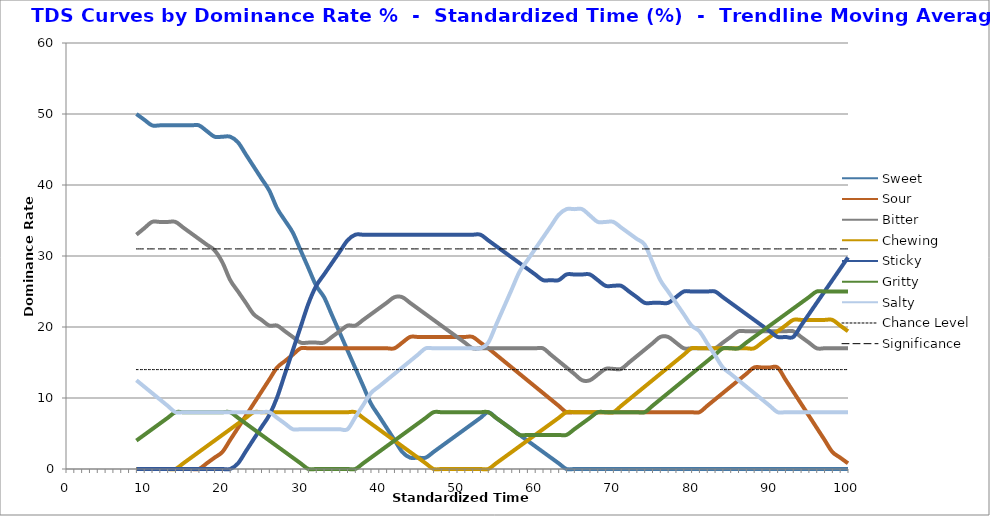
| Category | Sweet | Sour | Bitter | Chewing | Sticky | Gritty | Salty | Chance Level | Significance |
|---|---|---|---|---|---|---|---|---|---|
| 0.0 | 50 | 0 | 33 | 0 | 0 | 0 | 17 | 14 | 31 |
| 1.0 | 50 | 0 | 33 | 0 | 0 | 0 | 17 | 14 | 31 |
| 2.0 | 50 | 0 | 33 | 0 | 0 | 0 | 17 | 14 | 31 |
| 3.0 | 50 | 0 | 33 | 0 | 0 | 0 | 17 | 14 | 31 |
| 4.0 | 50 | 0 | 33 | 0 | 0 | 0 | 17 | 14 | 31 |
| 5.0 | 50 | 0 | 33 | 0 | 0 | 8 | 8 | 14 | 31 |
| 6.0 | 50 | 0 | 33 | 0 | 0 | 8 | 8 | 14 | 31 |
| 7.0 | 50 | 0 | 33 | 0 | 0 | 8 | 8 | 14 | 31 |
| 8.0 | 50 | 0 | 33 | 0 | 0 | 8 | 8 | 14 | 31 |
| 9.0 | 50 | 0 | 33 | 0 | 0 | 8 | 8 | 14 | 31 |
| 10.0 | 42 | 0 | 42 | 0 | 0 | 8 | 8 | 14 | 31 |
| 11.0 | 42 | 0 | 42 | 0 | 0 | 8 | 8 | 14 | 31 |
| 12.0 | 50 | 0 | 33 | 0 | 0 | 8 | 8 | 14 | 31 |
| 13.0 | 50 | 0 | 33 | 0 | 0 | 8 | 8 | 14 | 31 |
| 14.0 | 50 | 0 | 33 | 0 | 0 | 8 | 8 | 14 | 31 |
| 15.0 | 50 | 0 | 25 | 8 | 0 | 8 | 8 | 14 | 31 |
| 16.0 | 50 | 0 | 25 | 8 | 0 | 8 | 8 | 14 | 31 |
| 17.0 | 50 | 0 | 25 | 8 | 0 | 8 | 8 | 14 | 31 |
| 18.0 | 42 | 8 | 25 | 8 | 0 | 8 | 8 | 14 | 31 |
| 19.0 | 42 | 8 | 25 | 8 | 0 | 8 | 8 | 14 | 31 |
| 20.0 | 42 | 8 | 25 | 8 | 0 | 8 | 8 | 14 | 31 |
| 21.0 | 42 | 17 | 17 | 8 | 0 | 8 | 8 | 14 | 31 |
| 22.0 | 42 | 17 | 17 | 8 | 8 | 0 | 8 | 14 | 31 |
| 23.0 | 33 | 17 | 17 | 8 | 17 | 0 | 8 | 14 | 31 |
| 24.0 | 33 | 17 | 17 | 8 | 17 | 0 | 8 | 14 | 31 |
| 25.0 | 33 | 17 | 17 | 8 | 17 | 0 | 8 | 14 | 31 |
| 26.0 | 33 | 17 | 17 | 8 | 17 | 0 | 8 | 14 | 31 |
| 27.0 | 25 | 17 | 25 | 8 | 25 | 0 | 0 | 14 | 31 |
| 28.0 | 25 | 17 | 17 | 8 | 33 | 0 | 0 | 14 | 31 |
| 29.0 | 25 | 17 | 17 | 8 | 33 | 0 | 0 | 14 | 31 |
| 30.0 | 17 | 17 | 17 | 8 | 33 | 0 | 8 | 14 | 31 |
| 31.0 | 17 | 17 | 17 | 8 | 33 | 0 | 8 | 14 | 31 |
| 32.0 | 17 | 17 | 17 | 8 | 33 | 0 | 8 | 14 | 31 |
| 33.0 | 17 | 17 | 17 | 8 | 33 | 0 | 8 | 14 | 31 |
| 34.0 | 8 | 17 | 25 | 8 | 33 | 0 | 8 | 14 | 31 |
| 35.0 | 8 | 17 | 25 | 8 | 33 | 0 | 8 | 14 | 31 |
| 36.0 | 8 | 17 | 25 | 8 | 33 | 0 | 8 | 14 | 31 |
| 37.0 | 0 | 17 | 25 | 8 | 33 | 0 | 17 | 14 | 31 |
| 38.0 | 0 | 17 | 25 | 0 | 33 | 8 | 17 | 14 | 31 |
| 39.0 | 0 | 17 | 25 | 0 | 33 | 8 | 17 | 14 | 31 |
| 40.0 | 0 | 17 | 25 | 0 | 33 | 8 | 17 | 14 | 31 |
| 41.0 | 0 | 17 | 25 | 0 | 33 | 8 | 17 | 14 | 31 |
| 42.0 | 0 | 17 | 25 | 0 | 33 | 8 | 17 | 14 | 31 |
| 43.0 | 0 | 25 | 17 | 0 | 33 | 8 | 17 | 14 | 31 |
| 44.0 | 0 | 25 | 17 | 0 | 33 | 8 | 17 | 14 | 31 |
| 45.0 | 8 | 17 | 17 | 0 | 33 | 8 | 17 | 14 | 31 |
| 46.0 | 8 | 17 | 17 | 0 | 33 | 8 | 17 | 14 | 31 |
| 47.0 | 8 | 17 | 17 | 0 | 33 | 8 | 17 | 14 | 31 |
| 48.0 | 8 | 17 | 17 | 0 | 33 | 8 | 17 | 14 | 31 |
| 49.0 | 8 | 17 | 17 | 0 | 33 | 8 | 17 | 14 | 31 |
| 50.0 | 8 | 17 | 17 | 0 | 33 | 8 | 17 | 14 | 31 |
| 51.0 | 8 | 17 | 17 | 0 | 33 | 8 | 17 | 14 | 31 |
| 52.0 | 8 | 17 | 17 | 0 | 33 | 8 | 17 | 14 | 31 |
| 53.0 | 8 | 17 | 17 | 0 | 33 | 8 | 17 | 14 | 31 |
| 54.0 | 8 | 17 | 17 | 0 | 25 | 8 | 25 | 14 | 31 |
| 55.0 | 0 | 8 | 17 | 8 | 25 | 0 | 42 | 14 | 31 |
| 56.0 | 0 | 8 | 17 | 8 | 25 | 0 | 42 | 14 | 31 |
| 57.0 | 0 | 8 | 17 | 8 | 25 | 0 | 42 | 14 | 31 |
| 58.0 | 0 | 8 | 17 | 8 | 25 | 0 | 42 | 14 | 31 |
| 59.0 | 0 | 8 | 17 | 8 | 25 | 8 | 33 | 14 | 31 |
| 60.0 | 0 | 8 | 17 | 8 | 25 | 8 | 33 | 14 | 31 |
| 61.0 | 0 | 8 | 17 | 8 | 25 | 8 | 33 | 14 | 31 |
| 62.0 | 0 | 8 | 8 | 8 | 33 | 8 | 33 | 14 | 31 |
| 63.0 | 0 | 8 | 8 | 8 | 33 | 8 | 33 | 14 | 31 |
| 64.0 | 0 | 8 | 8 | 8 | 33 | 8 | 33 | 14 | 31 |
| 65.0 | 0 | 8 | 8 | 8 | 25 | 8 | 42 | 14 | 31 |
| 66.0 | 0 | 8 | 8 | 8 | 25 | 8 | 42 | 14 | 31 |
| 67.0 | 0 | 8 | 17 | 8 | 25 | 8 | 33 | 14 | 31 |
| 68.0 | 0 | 8 | 25 | 8 | 17 | 8 | 33 | 14 | 31 |
| 69.0 | 0 | 8 | 25 | 8 | 17 | 8 | 33 | 14 | 31 |
| 70.0 | 0 | 8 | 17 | 8 | 25 | 8 | 33 | 14 | 31 |
| 71.0 | 0 | 8 | 17 | 17 | 25 | 8 | 25 | 14 | 31 |
| 72.0 | 0 | 8 | 17 | 17 | 25 | 8 | 25 | 14 | 31 |
| 73.0 | 0 | 8 | 17 | 17 | 25 | 8 | 25 | 14 | 31 |
| 74.0 | 0 | 8 | 17 | 17 | 25 | 8 | 25 | 14 | 31 |
| 75.0 | 0 | 8 | 17 | 17 | 25 | 17 | 17 | 14 | 31 |
| 76.0 | 0 | 8 | 17 | 17 | 25 | 17 | 17 | 14 | 31 |
| 77.0 | 0 | 8 | 17 | 17 | 25 | 17 | 17 | 14 | 31 |
| 78.0 | 0 | 8 | 17 | 17 | 25 | 17 | 17 | 14 | 31 |
| 79.0 | 0 | 8 | 17 | 17 | 25 | 17 | 17 | 14 | 31 |
| 80.0 | 0 | 8 | 17 | 17 | 25 | 17 | 17 | 14 | 31 |
| 81.0 | 0 | 8 | 17 | 17 | 25 | 17 | 17 | 14 | 31 |
| 82.0 | 0 | 17 | 17 | 17 | 25 | 17 | 8 | 14 | 31 |
| 83.0 | 0 | 17 | 17 | 17 | 25 | 17 | 8 | 14 | 31 |
| 84.0 | 0 | 17 | 25 | 17 | 17 | 17 | 8 | 14 | 31 |
| 85.0 | 0 | 17 | 25 | 17 | 17 | 17 | 8 | 14 | 31 |
| 86.0 | 0 | 17 | 25 | 17 | 17 | 17 | 8 | 14 | 31 |
| 87.0 | 0 | 17 | 17 | 17 | 17 | 25 | 8 | 14 | 31 |
| 88.0 | 0 | 17 | 17 | 17 | 17 | 25 | 8 | 14 | 31 |
| 89.0 | 0 | 8 | 17 | 25 | 17 | 25 | 8 | 14 | 31 |
| 90.0 | 0 | 8 | 17 | 25 | 17 | 25 | 8 | 14 | 31 |
| 91.0 | 0 | 8 | 17 | 25 | 17 | 25 | 8 | 14 | 31 |
| 92.0 | 0 | 0 | 17 | 25 | 25 | 25 | 8 | 14 | 31 |
| 93.0 | 0 | 0 | 17 | 25 | 25 | 25 | 8 | 14 | 31 |
| 94.0 | 0 | 0 | 17 | 17 | 33 | 25 | 8 | 14 | 31 |
| 95.0 | 0 | 0 | 17 | 17 | 33 | 25 | 8 | 14 | 31 |
| 96.0 | 0 | 0 | 17 | 17 | 33 | 25 | 8 | 14 | 31 |
| 97.0 | 0 | 0 | 17 | 17 | 33 | 25 | 8 | 14 | 31 |
| 98.0 | 0 | 0 | 17 | 17 | 33 | 25 | 8 | 14 | 31 |
| 99.0 | 0 | 0 | 17 | 17 | 33 | 25 | 8 | 14 | 31 |
| 100.0 | 0 | 0 | 17 | 17 | 33 | 25 | 8 | 14 | 31 |